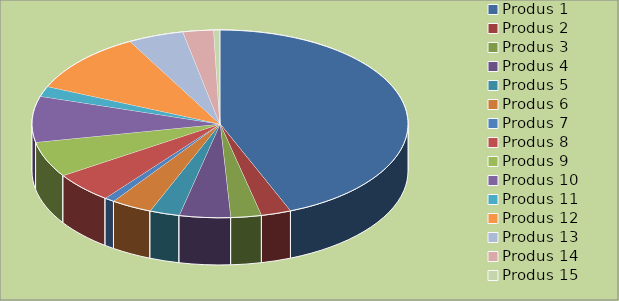
| Category | Series 0 |
|---|---|
| Produs 1 | 5000 |
| Produs 2 | 294 |
| Produs 3 | 300 |
| Produs 4 | 500 |
| Produs 5 | 294 |
| Produs 6 | 400 |
| Produs 7 | 100 |
| Produs 8 | 600 |
| Produs 9 | 700 |
| Produs 10 | 900 |
| Produs 11 | 200 |
| Produs 12 | 1200 |
| Produs 13 | 544 |
| Produs 14 | 300 |
| Produs 15 | 60 |